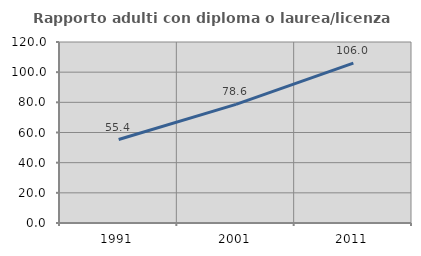
| Category | Rapporto adulti con diploma o laurea/licenza media  |
|---|---|
| 1991.0 | 55.357 |
| 2001.0 | 78.638 |
| 2011.0 | 105.951 |